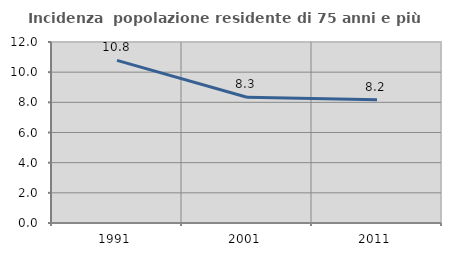
| Category | Incidenza  popolazione residente di 75 anni e più |
|---|---|
| 1991.0 | 10.78 |
| 2001.0 | 8.333 |
| 2011.0 | 8.165 |